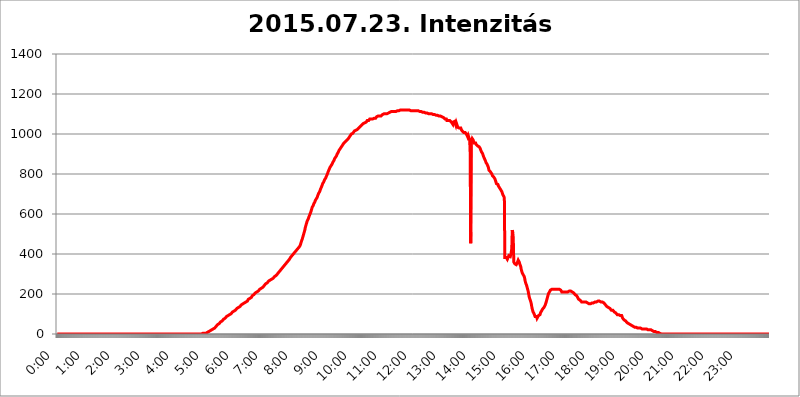
| Category | 2015.07.23. Intenzitás [W/m^2] |
|---|---|
| 0.0 | 0 |
| 0.0006944444444444445 | 0 |
| 0.001388888888888889 | 0 |
| 0.0020833333333333333 | 0 |
| 0.002777777777777778 | 0 |
| 0.003472222222222222 | 0 |
| 0.004166666666666667 | 0 |
| 0.004861111111111111 | 0 |
| 0.005555555555555556 | 0 |
| 0.0062499999999999995 | 0 |
| 0.006944444444444444 | 0 |
| 0.007638888888888889 | 0 |
| 0.008333333333333333 | 0 |
| 0.009027777777777779 | 0 |
| 0.009722222222222222 | 0 |
| 0.010416666666666666 | 0 |
| 0.011111111111111112 | 0 |
| 0.011805555555555555 | 0 |
| 0.012499999999999999 | 0 |
| 0.013194444444444444 | 0 |
| 0.013888888888888888 | 0 |
| 0.014583333333333332 | 0 |
| 0.015277777777777777 | 0 |
| 0.015972222222222224 | 0 |
| 0.016666666666666666 | 0 |
| 0.017361111111111112 | 0 |
| 0.018055555555555557 | 0 |
| 0.01875 | 0 |
| 0.019444444444444445 | 0 |
| 0.02013888888888889 | 0 |
| 0.020833333333333332 | 0 |
| 0.02152777777777778 | 0 |
| 0.022222222222222223 | 0 |
| 0.02291666666666667 | 0 |
| 0.02361111111111111 | 0 |
| 0.024305555555555556 | 0 |
| 0.024999999999999998 | 0 |
| 0.025694444444444447 | 0 |
| 0.02638888888888889 | 0 |
| 0.027083333333333334 | 0 |
| 0.027777777777777776 | 0 |
| 0.02847222222222222 | 0 |
| 0.029166666666666664 | 0 |
| 0.029861111111111113 | 0 |
| 0.030555555555555555 | 0 |
| 0.03125 | 0 |
| 0.03194444444444445 | 0 |
| 0.03263888888888889 | 0 |
| 0.03333333333333333 | 0 |
| 0.034027777777777775 | 0 |
| 0.034722222222222224 | 0 |
| 0.035416666666666666 | 0 |
| 0.036111111111111115 | 0 |
| 0.03680555555555556 | 0 |
| 0.0375 | 0 |
| 0.03819444444444444 | 0 |
| 0.03888888888888889 | 0 |
| 0.03958333333333333 | 0 |
| 0.04027777777777778 | 0 |
| 0.04097222222222222 | 0 |
| 0.041666666666666664 | 0 |
| 0.042361111111111106 | 0 |
| 0.04305555555555556 | 0 |
| 0.043750000000000004 | 0 |
| 0.044444444444444446 | 0 |
| 0.04513888888888889 | 0 |
| 0.04583333333333334 | 0 |
| 0.04652777777777778 | 0 |
| 0.04722222222222222 | 0 |
| 0.04791666666666666 | 0 |
| 0.04861111111111111 | 0 |
| 0.049305555555555554 | 0 |
| 0.049999999999999996 | 0 |
| 0.05069444444444445 | 0 |
| 0.051388888888888894 | 0 |
| 0.052083333333333336 | 0 |
| 0.05277777777777778 | 0 |
| 0.05347222222222222 | 0 |
| 0.05416666666666667 | 0 |
| 0.05486111111111111 | 0 |
| 0.05555555555555555 | 0 |
| 0.05625 | 0 |
| 0.05694444444444444 | 0 |
| 0.057638888888888885 | 0 |
| 0.05833333333333333 | 0 |
| 0.05902777777777778 | 0 |
| 0.059722222222222225 | 0 |
| 0.06041666666666667 | 0 |
| 0.061111111111111116 | 0 |
| 0.06180555555555556 | 0 |
| 0.0625 | 0 |
| 0.06319444444444444 | 0 |
| 0.06388888888888888 | 0 |
| 0.06458333333333334 | 0 |
| 0.06527777777777778 | 0 |
| 0.06597222222222222 | 0 |
| 0.06666666666666667 | 0 |
| 0.06736111111111111 | 0 |
| 0.06805555555555555 | 0 |
| 0.06874999999999999 | 0 |
| 0.06944444444444443 | 0 |
| 0.07013888888888889 | 0 |
| 0.07083333333333333 | 0 |
| 0.07152777777777779 | 0 |
| 0.07222222222222223 | 0 |
| 0.07291666666666667 | 0 |
| 0.07361111111111111 | 0 |
| 0.07430555555555556 | 0 |
| 0.075 | 0 |
| 0.07569444444444444 | 0 |
| 0.0763888888888889 | 0 |
| 0.07708333333333334 | 0 |
| 0.07777777777777778 | 0 |
| 0.07847222222222222 | 0 |
| 0.07916666666666666 | 0 |
| 0.0798611111111111 | 0 |
| 0.08055555555555556 | 0 |
| 0.08125 | 0 |
| 0.08194444444444444 | 0 |
| 0.08263888888888889 | 0 |
| 0.08333333333333333 | 0 |
| 0.08402777777777777 | 0 |
| 0.08472222222222221 | 0 |
| 0.08541666666666665 | 0 |
| 0.08611111111111112 | 0 |
| 0.08680555555555557 | 0 |
| 0.08750000000000001 | 0 |
| 0.08819444444444445 | 0 |
| 0.08888888888888889 | 0 |
| 0.08958333333333333 | 0 |
| 0.09027777777777778 | 0 |
| 0.09097222222222222 | 0 |
| 0.09166666666666667 | 0 |
| 0.09236111111111112 | 0 |
| 0.09305555555555556 | 0 |
| 0.09375 | 0 |
| 0.09444444444444444 | 0 |
| 0.09513888888888888 | 0 |
| 0.09583333333333333 | 0 |
| 0.09652777777777777 | 0 |
| 0.09722222222222222 | 0 |
| 0.09791666666666667 | 0 |
| 0.09861111111111111 | 0 |
| 0.09930555555555555 | 0 |
| 0.09999999999999999 | 0 |
| 0.10069444444444443 | 0 |
| 0.1013888888888889 | 0 |
| 0.10208333333333335 | 0 |
| 0.10277777777777779 | 0 |
| 0.10347222222222223 | 0 |
| 0.10416666666666667 | 0 |
| 0.10486111111111111 | 0 |
| 0.10555555555555556 | 0 |
| 0.10625 | 0 |
| 0.10694444444444444 | 0 |
| 0.1076388888888889 | 0 |
| 0.10833333333333334 | 0 |
| 0.10902777777777778 | 0 |
| 0.10972222222222222 | 0 |
| 0.1111111111111111 | 0 |
| 0.11180555555555556 | 0 |
| 0.11180555555555556 | 0 |
| 0.1125 | 0 |
| 0.11319444444444444 | 0 |
| 0.11388888888888889 | 0 |
| 0.11458333333333333 | 0 |
| 0.11527777777777777 | 0 |
| 0.11597222222222221 | 0 |
| 0.11666666666666665 | 0 |
| 0.1173611111111111 | 0 |
| 0.11805555555555557 | 0 |
| 0.11944444444444445 | 0 |
| 0.12013888888888889 | 0 |
| 0.12083333333333333 | 0 |
| 0.12152777777777778 | 0 |
| 0.12222222222222223 | 0 |
| 0.12291666666666667 | 0 |
| 0.12291666666666667 | 0 |
| 0.12361111111111112 | 0 |
| 0.12430555555555556 | 0 |
| 0.125 | 0 |
| 0.12569444444444444 | 0 |
| 0.12638888888888888 | 0 |
| 0.12708333333333333 | 0 |
| 0.16875 | 0 |
| 0.12847222222222224 | 0 |
| 0.12916666666666668 | 0 |
| 0.12986111111111112 | 0 |
| 0.13055555555555556 | 0 |
| 0.13125 | 0 |
| 0.13194444444444445 | 0 |
| 0.1326388888888889 | 0 |
| 0.13333333333333333 | 0 |
| 0.13402777777777777 | 0 |
| 0.13402777777777777 | 0 |
| 0.13472222222222222 | 0 |
| 0.13541666666666666 | 0 |
| 0.1361111111111111 | 0 |
| 0.13749999999999998 | 0 |
| 0.13819444444444443 | 0 |
| 0.1388888888888889 | 0 |
| 0.13958333333333334 | 0 |
| 0.14027777777777778 | 0 |
| 0.14097222222222222 | 0 |
| 0.14166666666666666 | 0 |
| 0.1423611111111111 | 0 |
| 0.14305555555555557 | 0 |
| 0.14375000000000002 | 0 |
| 0.14444444444444446 | 0 |
| 0.1451388888888889 | 0 |
| 0.1451388888888889 | 0 |
| 0.14652777777777778 | 0 |
| 0.14722222222222223 | 0 |
| 0.14791666666666667 | 0 |
| 0.1486111111111111 | 0 |
| 0.14930555555555555 | 0 |
| 0.15 | 0 |
| 0.15069444444444444 | 0 |
| 0.15138888888888888 | 0 |
| 0.15208333333333332 | 0 |
| 0.15277777777777776 | 0 |
| 0.15347222222222223 | 0 |
| 0.15416666666666667 | 0 |
| 0.15486111111111112 | 0 |
| 0.15555555555555556 | 0 |
| 0.15625 | 0 |
| 0.15694444444444444 | 0 |
| 0.15763888888888888 | 0 |
| 0.15833333333333333 | 0 |
| 0.15902777777777777 | 0 |
| 0.15972222222222224 | 0 |
| 0.16041666666666668 | 0 |
| 0.16111111111111112 | 0 |
| 0.16180555555555556 | 0 |
| 0.1625 | 0 |
| 0.16319444444444445 | 0 |
| 0.1638888888888889 | 0 |
| 0.16458333333333333 | 0 |
| 0.16527777777777777 | 0 |
| 0.16597222222222222 | 0 |
| 0.16666666666666666 | 0 |
| 0.1673611111111111 | 0 |
| 0.16805555555555554 | 0 |
| 0.16874999999999998 | 0 |
| 0.16944444444444443 | 0 |
| 0.17013888888888887 | 0 |
| 0.1708333333333333 | 0 |
| 0.17152777777777775 | 0 |
| 0.17222222222222225 | 0 |
| 0.1729166666666667 | 0 |
| 0.17361111111111113 | 0 |
| 0.17430555555555557 | 0 |
| 0.17500000000000002 | 0 |
| 0.17569444444444446 | 0 |
| 0.1763888888888889 | 0 |
| 0.17708333333333334 | 0 |
| 0.17777777777777778 | 0 |
| 0.17847222222222223 | 0 |
| 0.17916666666666667 | 0 |
| 0.1798611111111111 | 0 |
| 0.18055555555555555 | 0 |
| 0.18125 | 0 |
| 0.18194444444444444 | 0 |
| 0.1826388888888889 | 0 |
| 0.18333333333333335 | 0 |
| 0.1840277777777778 | 0 |
| 0.18472222222222223 | 0 |
| 0.18541666666666667 | 0 |
| 0.18611111111111112 | 0 |
| 0.18680555555555556 | 0 |
| 0.1875 | 0 |
| 0.18819444444444444 | 0 |
| 0.18888888888888888 | 0 |
| 0.18958333333333333 | 0 |
| 0.19027777777777777 | 0 |
| 0.1909722222222222 | 0 |
| 0.19166666666666665 | 0 |
| 0.19236111111111112 | 0 |
| 0.19305555555555554 | 0 |
| 0.19375 | 0 |
| 0.19444444444444445 | 0 |
| 0.1951388888888889 | 0 |
| 0.19583333333333333 | 0 |
| 0.19652777777777777 | 0 |
| 0.19722222222222222 | 0 |
| 0.19791666666666666 | 0 |
| 0.1986111111111111 | 0 |
| 0.19930555555555554 | 0 |
| 0.19999999999999998 | 0 |
| 0.20069444444444443 | 0 |
| 0.20138888888888887 | 0 |
| 0.2020833333333333 | 0 |
| 0.2027777777777778 | 0 |
| 0.2034722222222222 | 0 |
| 0.2041666666666667 | 3.525 |
| 0.20486111111111113 | 3.525 |
| 0.20555555555555557 | 3.525 |
| 0.20625000000000002 | 3.525 |
| 0.20694444444444446 | 3.525 |
| 0.2076388888888889 | 3.525 |
| 0.20833333333333334 | 3.525 |
| 0.20902777777777778 | 7.887 |
| 0.20972222222222223 | 7.887 |
| 0.21041666666666667 | 7.887 |
| 0.2111111111111111 | 7.887 |
| 0.21180555555555555 | 12.257 |
| 0.2125 | 12.257 |
| 0.21319444444444444 | 12.257 |
| 0.2138888888888889 | 12.257 |
| 0.21458333333333335 | 16.636 |
| 0.2152777777777778 | 16.636 |
| 0.21597222222222223 | 16.636 |
| 0.21666666666666667 | 21.024 |
| 0.21736111111111112 | 21.024 |
| 0.21805555555555556 | 21.024 |
| 0.21875 | 25.419 |
| 0.21944444444444444 | 25.419 |
| 0.22013888888888888 | 25.419 |
| 0.22083333333333333 | 29.823 |
| 0.22152777777777777 | 29.823 |
| 0.2222222222222222 | 29.823 |
| 0.22291666666666665 | 38.653 |
| 0.2236111111111111 | 38.653 |
| 0.22430555555555556 | 43.079 |
| 0.225 | 47.511 |
| 0.22569444444444445 | 47.511 |
| 0.2263888888888889 | 51.951 |
| 0.22708333333333333 | 51.951 |
| 0.22777777777777777 | 56.398 |
| 0.22847222222222222 | 56.398 |
| 0.22916666666666666 | 60.85 |
| 0.2298611111111111 | 60.85 |
| 0.23055555555555554 | 65.31 |
| 0.23124999999999998 | 65.31 |
| 0.23194444444444443 | 65.31 |
| 0.23263888888888887 | 69.775 |
| 0.2333333333333333 | 74.246 |
| 0.2340277777777778 | 74.246 |
| 0.2347222222222222 | 78.722 |
| 0.2354166666666667 | 78.722 |
| 0.23611111111111113 | 83.205 |
| 0.23680555555555557 | 83.205 |
| 0.23750000000000002 | 87.692 |
| 0.23819444444444446 | 87.692 |
| 0.2388888888888889 | 92.184 |
| 0.23958333333333334 | 92.184 |
| 0.24027777777777778 | 92.184 |
| 0.24097222222222223 | 96.682 |
| 0.24166666666666667 | 96.682 |
| 0.2423611111111111 | 101.184 |
| 0.24305555555555555 | 101.184 |
| 0.24375 | 101.184 |
| 0.24444444444444446 | 105.69 |
| 0.24513888888888888 | 105.69 |
| 0.24583333333333335 | 110.201 |
| 0.2465277777777778 | 110.201 |
| 0.24722222222222223 | 114.716 |
| 0.24791666666666667 | 114.716 |
| 0.24861111111111112 | 114.716 |
| 0.24930555555555556 | 119.235 |
| 0.25 | 119.235 |
| 0.25069444444444444 | 123.758 |
| 0.2513888888888889 | 123.758 |
| 0.2520833333333333 | 128.284 |
| 0.25277777777777777 | 128.284 |
| 0.2534722222222222 | 132.814 |
| 0.25416666666666665 | 132.814 |
| 0.2548611111111111 | 137.347 |
| 0.2555555555555556 | 137.347 |
| 0.25625000000000003 | 137.347 |
| 0.2569444444444445 | 141.884 |
| 0.2576388888888889 | 141.884 |
| 0.25833333333333336 | 146.423 |
| 0.2590277777777778 | 146.423 |
| 0.25972222222222224 | 150.964 |
| 0.2604166666666667 | 150.964 |
| 0.2611111111111111 | 150.964 |
| 0.26180555555555557 | 155.509 |
| 0.2625 | 155.509 |
| 0.26319444444444445 | 155.509 |
| 0.2638888888888889 | 160.056 |
| 0.26458333333333334 | 160.056 |
| 0.2652777777777778 | 164.605 |
| 0.2659722222222222 | 164.605 |
| 0.26666666666666666 | 164.605 |
| 0.2673611111111111 | 169.156 |
| 0.26805555555555555 | 173.709 |
| 0.26875 | 173.709 |
| 0.26944444444444443 | 173.709 |
| 0.2701388888888889 | 178.264 |
| 0.2708333333333333 | 182.82 |
| 0.27152777777777776 | 182.82 |
| 0.2722222222222222 | 182.82 |
| 0.27291666666666664 | 187.378 |
| 0.2736111111111111 | 191.937 |
| 0.2743055555555555 | 191.937 |
| 0.27499999999999997 | 191.937 |
| 0.27569444444444446 | 196.497 |
| 0.27638888888888885 | 201.058 |
| 0.27708333333333335 | 201.058 |
| 0.2777777777777778 | 205.62 |
| 0.27847222222222223 | 205.62 |
| 0.2791666666666667 | 210.182 |
| 0.2798611111111111 | 210.182 |
| 0.28055555555555556 | 210.182 |
| 0.28125 | 214.746 |
| 0.28194444444444444 | 214.746 |
| 0.2826388888888889 | 219.309 |
| 0.2833333333333333 | 219.309 |
| 0.28402777777777777 | 223.873 |
| 0.2847222222222222 | 223.873 |
| 0.28541666666666665 | 223.873 |
| 0.28611111111111115 | 228.436 |
| 0.28680555555555554 | 228.436 |
| 0.28750000000000003 | 233 |
| 0.2881944444444445 | 233 |
| 0.2888888888888889 | 237.564 |
| 0.28958333333333336 | 237.564 |
| 0.2902777777777778 | 242.127 |
| 0.29097222222222224 | 242.127 |
| 0.2916666666666667 | 246.689 |
| 0.2923611111111111 | 251.251 |
| 0.29305555555555557 | 251.251 |
| 0.29375 | 255.813 |
| 0.29444444444444445 | 255.813 |
| 0.2951388888888889 | 260.373 |
| 0.29583333333333334 | 260.373 |
| 0.2965277777777778 | 264.932 |
| 0.2972222222222222 | 264.932 |
| 0.29791666666666666 | 269.49 |
| 0.2986111111111111 | 269.49 |
| 0.29930555555555555 | 269.49 |
| 0.3 | 274.047 |
| 0.30069444444444443 | 274.047 |
| 0.3013888888888889 | 278.603 |
| 0.3020833333333333 | 278.603 |
| 0.30277777777777776 | 278.603 |
| 0.3034722222222222 | 283.156 |
| 0.30416666666666664 | 283.156 |
| 0.3048611111111111 | 287.709 |
| 0.3055555555555555 | 287.709 |
| 0.30624999999999997 | 292.259 |
| 0.3069444444444444 | 292.259 |
| 0.3076388888888889 | 296.808 |
| 0.30833333333333335 | 296.808 |
| 0.3090277777777778 | 301.354 |
| 0.30972222222222223 | 301.354 |
| 0.3104166666666667 | 305.898 |
| 0.3111111111111111 | 310.44 |
| 0.31180555555555556 | 310.44 |
| 0.3125 | 314.98 |
| 0.31319444444444444 | 319.517 |
| 0.3138888888888889 | 324.052 |
| 0.3145833333333333 | 324.052 |
| 0.31527777777777777 | 328.584 |
| 0.3159722222222222 | 333.113 |
| 0.31666666666666665 | 333.113 |
| 0.31736111111111115 | 337.639 |
| 0.31805555555555554 | 342.162 |
| 0.31875000000000003 | 342.162 |
| 0.3194444444444445 | 346.682 |
| 0.3201388888888889 | 351.198 |
| 0.32083333333333336 | 351.198 |
| 0.3215277777777778 | 355.712 |
| 0.32222222222222224 | 360.221 |
| 0.3229166666666667 | 360.221 |
| 0.3236111111111111 | 364.728 |
| 0.32430555555555557 | 369.23 |
| 0.325 | 369.23 |
| 0.32569444444444445 | 373.729 |
| 0.3263888888888889 | 378.224 |
| 0.32708333333333334 | 382.715 |
| 0.3277777777777778 | 382.715 |
| 0.3284722222222222 | 387.202 |
| 0.32916666666666666 | 391.685 |
| 0.3298611111111111 | 396.164 |
| 0.33055555555555555 | 396.164 |
| 0.33125 | 400.638 |
| 0.33194444444444443 | 405.108 |
| 0.3326388888888889 | 405.108 |
| 0.3333333333333333 | 409.574 |
| 0.3340277777777778 | 409.574 |
| 0.3347222222222222 | 414.035 |
| 0.3354166666666667 | 418.492 |
| 0.3361111111111111 | 422.943 |
| 0.3368055555555556 | 422.943 |
| 0.33749999999999997 | 427.39 |
| 0.33819444444444446 | 431.833 |
| 0.33888888888888885 | 431.833 |
| 0.33958333333333335 | 436.27 |
| 0.34027777777777773 | 440.702 |
| 0.34097222222222223 | 445.129 |
| 0.3416666666666666 | 453.968 |
| 0.3423611111111111 | 462.786 |
| 0.3430555555555555 | 467.187 |
| 0.34375 | 475.972 |
| 0.3444444444444445 | 484.735 |
| 0.3451388888888889 | 493.475 |
| 0.3458333333333334 | 502.192 |
| 0.34652777777777777 | 510.885 |
| 0.34722222222222227 | 519.555 |
| 0.34791666666666665 | 532.513 |
| 0.34861111111111115 | 541.121 |
| 0.34930555555555554 | 549.704 |
| 0.35000000000000003 | 558.261 |
| 0.3506944444444444 | 566.793 |
| 0.3513888888888889 | 571.049 |
| 0.3520833333333333 | 575.299 |
| 0.3527777777777778 | 583.779 |
| 0.3534722222222222 | 588.009 |
| 0.3541666666666667 | 596.45 |
| 0.3548611111111111 | 600.661 |
| 0.35555555555555557 | 609.062 |
| 0.35625 | 617.436 |
| 0.35694444444444445 | 625.784 |
| 0.3576388888888889 | 634.105 |
| 0.35833333333333334 | 634.105 |
| 0.3590277777777778 | 642.4 |
| 0.3597222222222222 | 650.667 |
| 0.36041666666666666 | 654.791 |
| 0.3611111111111111 | 658.909 |
| 0.36180555555555555 | 667.123 |
| 0.3625 | 671.22 |
| 0.36319444444444443 | 675.311 |
| 0.3638888888888889 | 679.395 |
| 0.3645833333333333 | 683.473 |
| 0.3652777777777778 | 691.608 |
| 0.3659722222222222 | 695.666 |
| 0.3666666666666667 | 703.762 |
| 0.3673611111111111 | 707.8 |
| 0.3680555555555556 | 711.832 |
| 0.36874999999999997 | 719.877 |
| 0.36944444444444446 | 723.889 |
| 0.37013888888888885 | 731.896 |
| 0.37083333333333335 | 735.89 |
| 0.37152777777777773 | 743.859 |
| 0.37222222222222223 | 751.803 |
| 0.3729166666666666 | 755.766 |
| 0.3736111111111111 | 759.723 |
| 0.3743055555555555 | 763.674 |
| 0.375 | 771.559 |
| 0.3756944444444445 | 775.492 |
| 0.3763888888888889 | 779.42 |
| 0.3770833333333334 | 783.342 |
| 0.37777777777777777 | 791.169 |
| 0.37847222222222227 | 795.074 |
| 0.37916666666666665 | 802.868 |
| 0.37986111111111115 | 810.641 |
| 0.38055555555555554 | 814.519 |
| 0.38125000000000003 | 822.26 |
| 0.3819444444444444 | 826.123 |
| 0.3826388888888889 | 833.834 |
| 0.3833333333333333 | 837.682 |
| 0.3840277777777778 | 841.526 |
| 0.3847222222222222 | 845.365 |
| 0.3854166666666667 | 849.199 |
| 0.3861111111111111 | 853.029 |
| 0.38680555555555557 | 860.676 |
| 0.3875 | 864.493 |
| 0.38819444444444445 | 868.305 |
| 0.3888888888888889 | 875.918 |
| 0.38958333333333334 | 879.719 |
| 0.3902777777777778 | 883.516 |
| 0.3909722222222222 | 887.309 |
| 0.39166666666666666 | 891.099 |
| 0.3923611111111111 | 898.668 |
| 0.39305555555555555 | 902.447 |
| 0.39375 | 906.223 |
| 0.39444444444444443 | 909.996 |
| 0.3951388888888889 | 917.534 |
| 0.3958333333333333 | 917.534 |
| 0.3965277777777778 | 925.06 |
| 0.3972222222222222 | 928.819 |
| 0.3979166666666667 | 932.576 |
| 0.3986111111111111 | 936.33 |
| 0.3993055555555556 | 940.082 |
| 0.39999999999999997 | 943.832 |
| 0.40069444444444446 | 947.58 |
| 0.40138888888888885 | 951.327 |
| 0.40208333333333335 | 955.071 |
| 0.40277777777777773 | 958.814 |
| 0.40347222222222223 | 958.814 |
| 0.4041666666666666 | 962.555 |
| 0.4048611111111111 | 962.555 |
| 0.4055555555555555 | 962.555 |
| 0.40625 | 970.034 |
| 0.4069444444444445 | 970.034 |
| 0.4076388888888889 | 973.772 |
| 0.4083333333333334 | 977.508 |
| 0.40902777777777777 | 981.244 |
| 0.40972222222222227 | 984.98 |
| 0.41041666666666665 | 988.714 |
| 0.41111111111111115 | 992.448 |
| 0.41180555555555554 | 992.448 |
| 0.41250000000000003 | 999.916 |
| 0.4131944444444444 | 999.916 |
| 0.4138888888888889 | 1003.65 |
| 0.4145833333333333 | 1003.65 |
| 0.4152777777777778 | 1007.383 |
| 0.4159722222222222 | 1007.383 |
| 0.4166666666666667 | 1014.852 |
| 0.4173611111111111 | 1014.852 |
| 0.41805555555555557 | 1018.587 |
| 0.41875 | 1018.587 |
| 0.41944444444444445 | 1022.323 |
| 0.4201388888888889 | 1022.323 |
| 0.42083333333333334 | 1022.323 |
| 0.4215277777777778 | 1026.06 |
| 0.4222222222222222 | 1022.323 |
| 0.42291666666666666 | 1029.798 |
| 0.4236111111111111 | 1029.798 |
| 0.42430555555555555 | 1033.537 |
| 0.425 | 1037.277 |
| 0.42569444444444443 | 1037.277 |
| 0.4263888888888889 | 1041.019 |
| 0.4270833333333333 | 1044.762 |
| 0.4277777777777778 | 1048.508 |
| 0.4284722222222222 | 1048.508 |
| 0.4291666666666667 | 1052.255 |
| 0.4298611111111111 | 1052.255 |
| 0.4305555555555556 | 1056.004 |
| 0.43124999999999997 | 1056.004 |
| 0.43194444444444446 | 1059.756 |
| 0.43263888888888885 | 1059.756 |
| 0.43333333333333335 | 1059.756 |
| 0.43402777777777773 | 1063.51 |
| 0.43472222222222223 | 1067.267 |
| 0.4354166666666666 | 1067.267 |
| 0.4361111111111111 | 1067.267 |
| 0.4368055555555555 | 1067.267 |
| 0.4375 | 1071.027 |
| 0.4381944444444445 | 1074.789 |
| 0.4388888888888889 | 1074.789 |
| 0.4395833333333334 | 1078.555 |
| 0.44027777777777777 | 1074.789 |
| 0.44097222222222227 | 1074.789 |
| 0.44166666666666665 | 1074.789 |
| 0.44236111111111115 | 1074.789 |
| 0.44305555555555554 | 1074.789 |
| 0.44375000000000003 | 1078.555 |
| 0.4444444444444444 | 1078.555 |
| 0.4451388888888889 | 1078.555 |
| 0.4458333333333333 | 1078.555 |
| 0.4465277777777778 | 1078.555 |
| 0.4472222222222222 | 1078.555 |
| 0.4479166666666667 | 1086.097 |
| 0.4486111111111111 | 1086.097 |
| 0.44930555555555557 | 1089.873 |
| 0.45 | 1089.873 |
| 0.45069444444444445 | 1086.097 |
| 0.4513888888888889 | 1086.097 |
| 0.45208333333333334 | 1089.873 |
| 0.4527777777777778 | 1089.873 |
| 0.4534722222222222 | 1086.097 |
| 0.45416666666666666 | 1089.873 |
| 0.4548611111111111 | 1093.653 |
| 0.45555555555555555 | 1093.653 |
| 0.45625 | 1097.437 |
| 0.45694444444444443 | 1097.437 |
| 0.4576388888888889 | 1101.226 |
| 0.4583333333333333 | 1101.226 |
| 0.4590277777777778 | 1101.226 |
| 0.4597222222222222 | 1101.226 |
| 0.4604166666666667 | 1101.226 |
| 0.4611111111111111 | 1101.226 |
| 0.4618055555555556 | 1101.226 |
| 0.46249999999999997 | 1101.226 |
| 0.46319444444444446 | 1105.019 |
| 0.46388888888888885 | 1105.019 |
| 0.46458333333333335 | 1105.019 |
| 0.46527777777777773 | 1105.019 |
| 0.46597222222222223 | 1108.816 |
| 0.4666666666666666 | 1108.816 |
| 0.4673611111111111 | 1112.618 |
| 0.4680555555555555 | 1112.618 |
| 0.46875 | 1112.618 |
| 0.4694444444444445 | 1112.618 |
| 0.4701388888888889 | 1112.618 |
| 0.4708333333333334 | 1112.618 |
| 0.47152777777777777 | 1116.426 |
| 0.47222222222222227 | 1112.618 |
| 0.47291666666666665 | 1112.618 |
| 0.47361111111111115 | 1112.618 |
| 0.47430555555555554 | 1112.618 |
| 0.47500000000000003 | 1112.618 |
| 0.4756944444444444 | 1112.618 |
| 0.4763888888888889 | 1112.618 |
| 0.4770833333333333 | 1116.426 |
| 0.4777777777777778 | 1120.238 |
| 0.4784722222222222 | 1120.238 |
| 0.4791666666666667 | 1116.426 |
| 0.4798611111111111 | 1120.238 |
| 0.48055555555555557 | 1120.238 |
| 0.48125 | 1120.238 |
| 0.48194444444444445 | 1120.238 |
| 0.4826388888888889 | 1120.238 |
| 0.48333333333333334 | 1120.238 |
| 0.4840277777777778 | 1120.238 |
| 0.4847222222222222 | 1124.056 |
| 0.48541666666666666 | 1120.238 |
| 0.4861111111111111 | 1124.056 |
| 0.48680555555555555 | 1124.056 |
| 0.4875 | 1120.238 |
| 0.48819444444444443 | 1120.238 |
| 0.4888888888888889 | 1120.238 |
| 0.4895833333333333 | 1120.238 |
| 0.4902777777777778 | 1120.238 |
| 0.4909722222222222 | 1120.238 |
| 0.4916666666666667 | 1120.238 |
| 0.4923611111111111 | 1120.238 |
| 0.4930555555555556 | 1120.238 |
| 0.49374999999999997 | 1120.238 |
| 0.49444444444444446 | 1120.238 |
| 0.49513888888888885 | 1120.238 |
| 0.49583333333333335 | 1116.426 |
| 0.49652777777777773 | 1116.426 |
| 0.49722222222222223 | 1116.426 |
| 0.4979166666666666 | 1116.426 |
| 0.4986111111111111 | 1116.426 |
| 0.4993055555555555 | 1116.426 |
| 0.5 | 1116.426 |
| 0.5006944444444444 | 1116.426 |
| 0.5013888888888889 | 1116.426 |
| 0.5020833333333333 | 1116.426 |
| 0.5027777777777778 | 1116.426 |
| 0.5034722222222222 | 1116.426 |
| 0.5041666666666667 | 1116.426 |
| 0.5048611111111111 | 1116.426 |
| 0.5055555555555555 | 1116.426 |
| 0.50625 | 1116.426 |
| 0.5069444444444444 | 1112.618 |
| 0.5076388888888889 | 1112.618 |
| 0.5083333333333333 | 1112.618 |
| 0.5090277777777777 | 1112.618 |
| 0.5097222222222222 | 1108.816 |
| 0.5104166666666666 | 1112.618 |
| 0.5111111111111112 | 1108.816 |
| 0.5118055555555555 | 1108.816 |
| 0.5125000000000001 | 1108.816 |
| 0.5131944444444444 | 1108.816 |
| 0.513888888888889 | 1108.816 |
| 0.5145833333333333 | 1108.816 |
| 0.5152777777777778 | 1105.019 |
| 0.5159722222222222 | 1105.019 |
| 0.5166666666666667 | 1105.019 |
| 0.517361111111111 | 1105.019 |
| 0.5180555555555556 | 1105.019 |
| 0.5187499999999999 | 1105.019 |
| 0.5194444444444445 | 1101.226 |
| 0.5201388888888888 | 1101.226 |
| 0.5208333333333334 | 1101.226 |
| 0.5215277777777778 | 1101.226 |
| 0.5222222222222223 | 1101.226 |
| 0.5229166666666667 | 1101.226 |
| 0.5236111111111111 | 1101.226 |
| 0.5243055555555556 | 1101.226 |
| 0.525 | 1101.226 |
| 0.5256944444444445 | 1097.437 |
| 0.5263888888888889 | 1097.437 |
| 0.5270833333333333 | 1097.437 |
| 0.5277777777777778 | 1097.437 |
| 0.5284722222222222 | 1097.437 |
| 0.5291666666666667 | 1097.437 |
| 0.5298611111111111 | 1093.653 |
| 0.5305555555555556 | 1093.653 |
| 0.53125 | 1093.653 |
| 0.5319444444444444 | 1093.653 |
| 0.5326388888888889 | 1093.653 |
| 0.5333333333333333 | 1093.653 |
| 0.5340277777777778 | 1089.873 |
| 0.5347222222222222 | 1089.873 |
| 0.5354166666666667 | 1089.873 |
| 0.5361111111111111 | 1089.873 |
| 0.5368055555555555 | 1089.873 |
| 0.5375 | 1089.873 |
| 0.5381944444444444 | 1089.873 |
| 0.5388888888888889 | 1086.097 |
| 0.5395833333333333 | 1086.097 |
| 0.5402777777777777 | 1086.097 |
| 0.5409722222222222 | 1086.097 |
| 0.5416666666666666 | 1082.324 |
| 0.5423611111111112 | 1078.555 |
| 0.5430555555555555 | 1078.555 |
| 0.5437500000000001 | 1074.789 |
| 0.5444444444444444 | 1074.789 |
| 0.545138888888889 | 1071.027 |
| 0.5458333333333333 | 1074.789 |
| 0.5465277777777778 | 1067.267 |
| 0.5472222222222222 | 1067.267 |
| 0.5479166666666667 | 1067.267 |
| 0.548611111111111 | 1067.267 |
| 0.5493055555555556 | 1067.267 |
| 0.5499999999999999 | 1067.267 |
| 0.5506944444444445 | 1067.267 |
| 0.5513888888888888 | 1067.267 |
| 0.5520833333333334 | 1063.51 |
| 0.5527777777777778 | 1059.756 |
| 0.5534722222222223 | 1059.756 |
| 0.5541666666666667 | 1059.756 |
| 0.5548611111111111 | 1048.508 |
| 0.5555555555555556 | 1059.756 |
| 0.55625 | 1063.51 |
| 0.5569444444444445 | 1059.756 |
| 0.5576388888888889 | 1063.51 |
| 0.5583333333333333 | 1052.255 |
| 0.5590277777777778 | 1044.762 |
| 0.5597222222222222 | 1056.004 |
| 0.5604166666666667 | 1052.255 |
| 0.5611111111111111 | 1052.255 |
| 0.5618055555555556 | 1033.537 |
| 0.5625 | 1029.798 |
| 0.5631944444444444 | 1033.537 |
| 0.5638888888888889 | 1029.798 |
| 0.5645833333333333 | 1033.537 |
| 0.5652777777777778 | 1033.537 |
| 0.5659722222222222 | 1029.798 |
| 0.5666666666666667 | 1022.323 |
| 0.5673611111111111 | 1022.323 |
| 0.5680555555555555 | 1014.852 |
| 0.56875 | 1014.852 |
| 0.5694444444444444 | 1014.852 |
| 0.5701388888888889 | 1007.383 |
| 0.5708333333333333 | 1003.65 |
| 0.5715277777777777 | 1011.118 |
| 0.5722222222222222 | 1007.383 |
| 0.5729166666666666 | 1007.383 |
| 0.5736111111111112 | 1003.65 |
| 0.5743055555555555 | 996.182 |
| 0.5750000000000001 | 992.448 |
| 0.5756944444444444 | 984.98 |
| 0.576388888888889 | 992.448 |
| 0.5770833333333333 | 992.448 |
| 0.5777777777777778 | 992.448 |
| 0.5784722222222222 | 970.034 |
| 0.5791666666666667 | 902.447 |
| 0.579861111111111 | 453.968 |
| 0.5805555555555556 | 977.508 |
| 0.5812499999999999 | 970.034 |
| 0.5819444444444445 | 977.508 |
| 0.5826388888888888 | 977.508 |
| 0.5833333333333334 | 970.034 |
| 0.5840277777777778 | 970.034 |
| 0.5847222222222223 | 955.071 |
| 0.5854166666666667 | 958.814 |
| 0.5861111111111111 | 955.071 |
| 0.5868055555555556 | 955.071 |
| 0.5875 | 947.58 |
| 0.5881944444444445 | 947.58 |
| 0.5888888888888889 | 943.832 |
| 0.5895833333333333 | 940.082 |
| 0.5902777777777778 | 940.082 |
| 0.5909722222222222 | 940.082 |
| 0.5916666666666667 | 936.33 |
| 0.5923611111111111 | 932.576 |
| 0.5930555555555556 | 928.819 |
| 0.59375 | 921.298 |
| 0.5944444444444444 | 917.534 |
| 0.5951388888888889 | 909.996 |
| 0.5958333333333333 | 906.223 |
| 0.5965277777777778 | 902.447 |
| 0.5972222222222222 | 894.885 |
| 0.5979166666666667 | 887.309 |
| 0.5986111111111111 | 883.516 |
| 0.5993055555555555 | 875.918 |
| 0.6 | 872.114 |
| 0.6006944444444444 | 864.493 |
| 0.6013888888888889 | 856.855 |
| 0.6020833333333333 | 853.029 |
| 0.6027777777777777 | 849.199 |
| 0.6034722222222222 | 845.365 |
| 0.6041666666666666 | 837.682 |
| 0.6048611111111112 | 829.981 |
| 0.6055555555555555 | 818.392 |
| 0.6062500000000001 | 818.392 |
| 0.6069444444444444 | 818.392 |
| 0.607638888888889 | 810.641 |
| 0.6083333333333333 | 806.757 |
| 0.6090277777777778 | 806.757 |
| 0.6097222222222222 | 798.974 |
| 0.6104166666666667 | 791.169 |
| 0.611111111111111 | 791.169 |
| 0.6118055555555556 | 787.258 |
| 0.6124999999999999 | 783.342 |
| 0.6131944444444445 | 779.42 |
| 0.6138888888888888 | 775.492 |
| 0.6145833333333334 | 775.492 |
| 0.6152777777777778 | 759.723 |
| 0.6159722222222223 | 751.803 |
| 0.6166666666666667 | 751.803 |
| 0.6173611111111111 | 751.803 |
| 0.6180555555555556 | 747.834 |
| 0.61875 | 739.877 |
| 0.6194444444444445 | 735.89 |
| 0.6201388888888889 | 731.896 |
| 0.6208333333333333 | 727.896 |
| 0.6215277777777778 | 723.889 |
| 0.6222222222222222 | 723.889 |
| 0.6229166666666667 | 719.877 |
| 0.6236111111111111 | 711.832 |
| 0.6243055555555556 | 703.762 |
| 0.625 | 695.666 |
| 0.6256944444444444 | 691.608 |
| 0.6263888888888889 | 687.544 |
| 0.6270833333333333 | 679.395 |
| 0.6277777777777778 | 382.715 |
| 0.6284722222222222 | 387.202 |
| 0.6291666666666667 | 382.715 |
| 0.6298611111111111 | 382.715 |
| 0.6305555555555555 | 378.224 |
| 0.63125 | 373.729 |
| 0.6319444444444444 | 373.729 |
| 0.6326388888888889 | 378.224 |
| 0.6333333333333333 | 391.685 |
| 0.6340277777777777 | 387.202 |
| 0.6347222222222222 | 387.202 |
| 0.6354166666666666 | 387.202 |
| 0.6361111111111112 | 396.164 |
| 0.6368055555555555 | 409.574 |
| 0.6375000000000001 | 427.39 |
| 0.6381944444444444 | 519.555 |
| 0.638888888888889 | 506.542 |
| 0.6395833333333333 | 480.356 |
| 0.6402777777777778 | 360.221 |
| 0.6409722222222222 | 360.221 |
| 0.6416666666666667 | 351.198 |
| 0.642361111111111 | 351.198 |
| 0.6430555555555556 | 346.682 |
| 0.6437499999999999 | 346.682 |
| 0.6444444444444445 | 351.198 |
| 0.6451388888888888 | 355.712 |
| 0.6458333333333334 | 360.221 |
| 0.6465277777777778 | 369.23 |
| 0.6472222222222223 | 369.23 |
| 0.6479166666666667 | 360.221 |
| 0.6486111111111111 | 351.198 |
| 0.6493055555555556 | 346.682 |
| 0.65 | 337.639 |
| 0.6506944444444445 | 324.052 |
| 0.6513888888888889 | 314.98 |
| 0.6520833333333333 | 305.898 |
| 0.6527777777777778 | 301.354 |
| 0.6534722222222222 | 296.808 |
| 0.6541666666666667 | 296.808 |
| 0.6548611111111111 | 287.709 |
| 0.6555555555555556 | 278.603 |
| 0.65625 | 264.932 |
| 0.6569444444444444 | 255.813 |
| 0.6576388888888889 | 251.251 |
| 0.6583333333333333 | 242.127 |
| 0.6590277777777778 | 233 |
| 0.6597222222222222 | 223.873 |
| 0.6604166666666667 | 214.746 |
| 0.6611111111111111 | 201.058 |
| 0.6618055555555555 | 187.378 |
| 0.6625 | 178.264 |
| 0.6631944444444444 | 173.709 |
| 0.6638888888888889 | 164.605 |
| 0.6645833333333333 | 155.509 |
| 0.6652777777777777 | 141.884 |
| 0.6659722222222222 | 128.284 |
| 0.6666666666666666 | 119.235 |
| 0.6673611111111111 | 110.201 |
| 0.6680555555555556 | 105.69 |
| 0.6687500000000001 | 101.184 |
| 0.6694444444444444 | 96.682 |
| 0.6701388888888888 | 87.692 |
| 0.6708333333333334 | 83.205 |
| 0.6715277777777778 | 87.692 |
| 0.6722222222222222 | 87.692 |
| 0.6729166666666666 | 78.722 |
| 0.6736111111111112 | 78.722 |
| 0.6743055555555556 | 83.205 |
| 0.6749999999999999 | 92.184 |
| 0.6756944444444444 | 92.184 |
| 0.6763888888888889 | 96.682 |
| 0.6770833333333334 | 96.682 |
| 0.6777777777777777 | 105.69 |
| 0.6784722222222223 | 110.201 |
| 0.6791666666666667 | 114.716 |
| 0.6798611111111111 | 119.235 |
| 0.6805555555555555 | 123.758 |
| 0.68125 | 123.758 |
| 0.6819444444444445 | 128.284 |
| 0.6826388888888889 | 132.814 |
| 0.6833333333333332 | 137.347 |
| 0.6840277777777778 | 141.884 |
| 0.6847222222222222 | 146.423 |
| 0.6854166666666667 | 155.509 |
| 0.686111111111111 | 164.605 |
| 0.6868055555555556 | 173.709 |
| 0.6875 | 182.82 |
| 0.6881944444444444 | 191.937 |
| 0.688888888888889 | 201.058 |
| 0.6895833333333333 | 205.62 |
| 0.6902777777777778 | 210.182 |
| 0.6909722222222222 | 214.746 |
| 0.6916666666666668 | 219.309 |
| 0.6923611111111111 | 219.309 |
| 0.6930555555555555 | 223.873 |
| 0.69375 | 223.873 |
| 0.6944444444444445 | 223.873 |
| 0.6951388888888889 | 223.873 |
| 0.6958333333333333 | 223.873 |
| 0.6965277777777777 | 223.873 |
| 0.6972222222222223 | 223.873 |
| 0.6979166666666666 | 223.873 |
| 0.6986111111111111 | 223.873 |
| 0.6993055555555556 | 223.873 |
| 0.7000000000000001 | 223.873 |
| 0.7006944444444444 | 223.873 |
| 0.7013888888888888 | 223.873 |
| 0.7020833333333334 | 223.873 |
| 0.7027777777777778 | 223.873 |
| 0.7034722222222222 | 223.873 |
| 0.7041666666666666 | 223.873 |
| 0.7048611111111112 | 219.309 |
| 0.7055555555555556 | 219.309 |
| 0.7062499999999999 | 219.309 |
| 0.7069444444444444 | 214.746 |
| 0.7076388888888889 | 210.182 |
| 0.7083333333333334 | 210.182 |
| 0.7090277777777777 | 205.62 |
| 0.7097222222222223 | 210.182 |
| 0.7104166666666667 | 210.182 |
| 0.7111111111111111 | 210.182 |
| 0.7118055555555555 | 210.182 |
| 0.7125 | 210.182 |
| 0.7131944444444445 | 210.182 |
| 0.7138888888888889 | 210.182 |
| 0.7145833333333332 | 210.182 |
| 0.7152777777777778 | 210.182 |
| 0.7159722222222222 | 210.182 |
| 0.7166666666666667 | 210.182 |
| 0.717361111111111 | 214.746 |
| 0.7180555555555556 | 214.746 |
| 0.71875 | 214.746 |
| 0.7194444444444444 | 214.746 |
| 0.720138888888889 | 214.746 |
| 0.7208333333333333 | 210.182 |
| 0.7215277777777778 | 210.182 |
| 0.7222222222222222 | 210.182 |
| 0.7229166666666668 | 210.182 |
| 0.7236111111111111 | 210.182 |
| 0.7243055555555555 | 205.62 |
| 0.725 | 205.62 |
| 0.7256944444444445 | 201.058 |
| 0.7263888888888889 | 196.497 |
| 0.7270833333333333 | 196.497 |
| 0.7277777777777777 | 191.937 |
| 0.7284722222222223 | 191.937 |
| 0.7291666666666666 | 187.378 |
| 0.7298611111111111 | 182.82 |
| 0.7305555555555556 | 178.264 |
| 0.7312500000000001 | 173.709 |
| 0.7319444444444444 | 173.709 |
| 0.7326388888888888 | 169.156 |
| 0.7333333333333334 | 169.156 |
| 0.7340277777777778 | 164.605 |
| 0.7347222222222222 | 164.605 |
| 0.7354166666666666 | 160.056 |
| 0.7361111111111112 | 160.056 |
| 0.7368055555555556 | 160.056 |
| 0.7374999999999999 | 160.056 |
| 0.7381944444444444 | 160.056 |
| 0.7388888888888889 | 160.056 |
| 0.7395833333333334 | 160.056 |
| 0.7402777777777777 | 160.056 |
| 0.7409722222222223 | 160.056 |
| 0.7416666666666667 | 160.056 |
| 0.7423611111111111 | 160.056 |
| 0.7430555555555555 | 155.509 |
| 0.74375 | 155.509 |
| 0.7444444444444445 | 155.509 |
| 0.7451388888888889 | 150.964 |
| 0.7458333333333332 | 150.964 |
| 0.7465277777777778 | 150.964 |
| 0.7472222222222222 | 150.964 |
| 0.7479166666666667 | 150.964 |
| 0.748611111111111 | 150.964 |
| 0.7493055555555556 | 150.964 |
| 0.75 | 155.509 |
| 0.7506944444444444 | 155.509 |
| 0.751388888888889 | 155.509 |
| 0.7520833333333333 | 155.509 |
| 0.7527777777777778 | 155.509 |
| 0.7534722222222222 | 160.056 |
| 0.7541666666666668 | 160.056 |
| 0.7548611111111111 | 160.056 |
| 0.7555555555555555 | 160.056 |
| 0.75625 | 160.056 |
| 0.7569444444444445 | 164.605 |
| 0.7576388888888889 | 164.605 |
| 0.7583333333333333 | 164.605 |
| 0.7590277777777777 | 164.605 |
| 0.7597222222222223 | 164.605 |
| 0.7604166666666666 | 164.605 |
| 0.7611111111111111 | 164.605 |
| 0.7618055555555556 | 164.605 |
| 0.7625000000000001 | 160.056 |
| 0.7631944444444444 | 160.056 |
| 0.7638888888888888 | 160.056 |
| 0.7645833333333334 | 160.056 |
| 0.7652777777777778 | 155.509 |
| 0.7659722222222222 | 155.509 |
| 0.7666666666666666 | 155.509 |
| 0.7673611111111112 | 150.964 |
| 0.7680555555555556 | 150.964 |
| 0.7687499999999999 | 146.423 |
| 0.7694444444444444 | 146.423 |
| 0.7701388888888889 | 141.884 |
| 0.7708333333333334 | 137.347 |
| 0.7715277777777777 | 137.347 |
| 0.7722222222222223 | 132.814 |
| 0.7729166666666667 | 132.814 |
| 0.7736111111111111 | 132.814 |
| 0.7743055555555555 | 132.814 |
| 0.775 | 128.284 |
| 0.7756944444444445 | 128.284 |
| 0.7763888888888889 | 123.758 |
| 0.7770833333333332 | 119.235 |
| 0.7777777777777778 | 119.235 |
| 0.7784722222222222 | 119.235 |
| 0.7791666666666667 | 119.235 |
| 0.779861111111111 | 114.716 |
| 0.7805555555555556 | 114.716 |
| 0.78125 | 110.201 |
| 0.7819444444444444 | 110.201 |
| 0.782638888888889 | 105.69 |
| 0.7833333333333333 | 105.69 |
| 0.7840277777777778 | 105.69 |
| 0.7847222222222222 | 105.69 |
| 0.7854166666666668 | 96.682 |
| 0.7861111111111111 | 96.682 |
| 0.7868055555555555 | 96.682 |
| 0.7875 | 96.682 |
| 0.7881944444444445 | 96.682 |
| 0.7888888888888889 | 96.682 |
| 0.7895833333333333 | 92.184 |
| 0.7902777777777777 | 92.184 |
| 0.7909722222222223 | 92.184 |
| 0.7916666666666666 | 92.184 |
| 0.7923611111111111 | 92.184 |
| 0.7930555555555556 | 78.722 |
| 0.7937500000000001 | 74.246 |
| 0.7944444444444444 | 74.246 |
| 0.7951388888888888 | 69.775 |
| 0.7958333333333334 | 69.775 |
| 0.7965277777777778 | 65.31 |
| 0.7972222222222222 | 65.31 |
| 0.7979166666666666 | 65.31 |
| 0.7986111111111112 | 60.85 |
| 0.7993055555555556 | 56.398 |
| 0.7999999999999999 | 56.398 |
| 0.8006944444444444 | 56.398 |
| 0.8013888888888889 | 51.951 |
| 0.8020833333333334 | 51.951 |
| 0.8027777777777777 | 47.511 |
| 0.8034722222222223 | 47.511 |
| 0.8041666666666667 | 43.079 |
| 0.8048611111111111 | 43.079 |
| 0.8055555555555555 | 43.079 |
| 0.80625 | 38.653 |
| 0.8069444444444445 | 38.653 |
| 0.8076388888888889 | 38.653 |
| 0.8083333333333332 | 34.234 |
| 0.8090277777777778 | 34.234 |
| 0.8097222222222222 | 34.234 |
| 0.8104166666666667 | 34.234 |
| 0.811111111111111 | 34.234 |
| 0.8118055555555556 | 34.234 |
| 0.8125 | 29.823 |
| 0.8131944444444444 | 29.823 |
| 0.813888888888889 | 29.823 |
| 0.8145833333333333 | 29.823 |
| 0.8152777777777778 | 29.823 |
| 0.8159722222222222 | 29.823 |
| 0.8166666666666668 | 29.823 |
| 0.8173611111111111 | 29.823 |
| 0.8180555555555555 | 29.823 |
| 0.81875 | 25.419 |
| 0.8194444444444445 | 25.419 |
| 0.8201388888888889 | 25.419 |
| 0.8208333333333333 | 25.419 |
| 0.8215277777777777 | 25.419 |
| 0.8222222222222223 | 25.419 |
| 0.8229166666666666 | 25.419 |
| 0.8236111111111111 | 25.419 |
| 0.8243055555555556 | 25.419 |
| 0.8250000000000001 | 25.419 |
| 0.8256944444444444 | 25.419 |
| 0.8263888888888888 | 25.419 |
| 0.8270833333333334 | 25.419 |
| 0.8277777777777778 | 25.419 |
| 0.8284722222222222 | 21.024 |
| 0.8291666666666666 | 21.024 |
| 0.8298611111111112 | 21.024 |
| 0.8305555555555556 | 21.024 |
| 0.8312499999999999 | 21.024 |
| 0.8319444444444444 | 21.024 |
| 0.8326388888888889 | 21.024 |
| 0.8333333333333334 | 16.636 |
| 0.8340277777777777 | 16.636 |
| 0.8347222222222223 | 16.636 |
| 0.8354166666666667 | 16.636 |
| 0.8361111111111111 | 12.257 |
| 0.8368055555555555 | 12.257 |
| 0.8375 | 12.257 |
| 0.8381944444444445 | 12.257 |
| 0.8388888888888889 | 12.257 |
| 0.8395833333333332 | 12.257 |
| 0.8402777777777778 | 12.257 |
| 0.8409722222222222 | 7.887 |
| 0.8416666666666667 | 7.887 |
| 0.842361111111111 | 7.887 |
| 0.8430555555555556 | 7.887 |
| 0.84375 | 3.525 |
| 0.8444444444444444 | 3.525 |
| 0.845138888888889 | 3.525 |
| 0.8458333333333333 | 3.525 |
| 0.8465277777777778 | 0 |
| 0.8472222222222222 | 0 |
| 0.8479166666666668 | 0 |
| 0.8486111111111111 | 0 |
| 0.8493055555555555 | 0 |
| 0.85 | 0 |
| 0.8506944444444445 | 0 |
| 0.8513888888888889 | 0 |
| 0.8520833333333333 | 0 |
| 0.8527777777777777 | 0 |
| 0.8534722222222223 | 0 |
| 0.8541666666666666 | 0 |
| 0.8548611111111111 | 0 |
| 0.8555555555555556 | 0 |
| 0.8562500000000001 | 0 |
| 0.8569444444444444 | 0 |
| 0.8576388888888888 | 0 |
| 0.8583333333333334 | 0 |
| 0.8590277777777778 | 0 |
| 0.8597222222222222 | 0 |
| 0.8604166666666666 | 0 |
| 0.8611111111111112 | 0 |
| 0.8618055555555556 | 0 |
| 0.8624999999999999 | 0 |
| 0.8631944444444444 | 0 |
| 0.8638888888888889 | 0 |
| 0.8645833333333334 | 0 |
| 0.8652777777777777 | 0 |
| 0.8659722222222223 | 0 |
| 0.8666666666666667 | 0 |
| 0.8673611111111111 | 0 |
| 0.8680555555555555 | 0 |
| 0.86875 | 0 |
| 0.8694444444444445 | 0 |
| 0.8701388888888889 | 0 |
| 0.8708333333333332 | 0 |
| 0.8715277777777778 | 0 |
| 0.8722222222222222 | 0 |
| 0.8729166666666667 | 0 |
| 0.873611111111111 | 0 |
| 0.8743055555555556 | 0 |
| 0.875 | 0 |
| 0.8756944444444444 | 0 |
| 0.876388888888889 | 0 |
| 0.8770833333333333 | 0 |
| 0.8777777777777778 | 0 |
| 0.8784722222222222 | 0 |
| 0.8791666666666668 | 0 |
| 0.8798611111111111 | 0 |
| 0.8805555555555555 | 0 |
| 0.88125 | 0 |
| 0.8819444444444445 | 0 |
| 0.8826388888888889 | 0 |
| 0.8833333333333333 | 0 |
| 0.8840277777777777 | 0 |
| 0.8847222222222223 | 0 |
| 0.8854166666666666 | 0 |
| 0.8861111111111111 | 0 |
| 0.8868055555555556 | 0 |
| 0.8875000000000001 | 0 |
| 0.8881944444444444 | 0 |
| 0.8888888888888888 | 0 |
| 0.8895833333333334 | 0 |
| 0.8902777777777778 | 0 |
| 0.8909722222222222 | 0 |
| 0.8916666666666666 | 0 |
| 0.8923611111111112 | 0 |
| 0.8930555555555556 | 0 |
| 0.8937499999999999 | 0 |
| 0.8944444444444444 | 0 |
| 0.8951388888888889 | 0 |
| 0.8958333333333334 | 0 |
| 0.8965277777777777 | 0 |
| 0.8972222222222223 | 0 |
| 0.8979166666666667 | 0 |
| 0.8986111111111111 | 0 |
| 0.8993055555555555 | 0 |
| 0.9 | 0 |
| 0.9006944444444445 | 0 |
| 0.9013888888888889 | 0 |
| 0.9020833333333332 | 0 |
| 0.9027777777777778 | 0 |
| 0.9034722222222222 | 0 |
| 0.9041666666666667 | 0 |
| 0.904861111111111 | 0 |
| 0.9055555555555556 | 0 |
| 0.90625 | 0 |
| 0.9069444444444444 | 0 |
| 0.907638888888889 | 0 |
| 0.9083333333333333 | 0 |
| 0.9090277777777778 | 0 |
| 0.9097222222222222 | 0 |
| 0.9104166666666668 | 0 |
| 0.9111111111111111 | 0 |
| 0.9118055555555555 | 0 |
| 0.9125 | 0 |
| 0.9131944444444445 | 0 |
| 0.9138888888888889 | 0 |
| 0.9145833333333333 | 0 |
| 0.9152777777777777 | 0 |
| 0.9159722222222223 | 0 |
| 0.9166666666666666 | 0 |
| 0.9173611111111111 | 0 |
| 0.9180555555555556 | 0 |
| 0.9187500000000001 | 0 |
| 0.9194444444444444 | 0 |
| 0.9201388888888888 | 0 |
| 0.9208333333333334 | 0 |
| 0.9215277777777778 | 0 |
| 0.9222222222222222 | 0 |
| 0.9229166666666666 | 0 |
| 0.9236111111111112 | 0 |
| 0.9243055555555556 | 0 |
| 0.9249999999999999 | 0 |
| 0.9256944444444444 | 0 |
| 0.9263888888888889 | 0 |
| 0.9270833333333334 | 0 |
| 0.9277777777777777 | 0 |
| 0.9284722222222223 | 0 |
| 0.9291666666666667 | 0 |
| 0.9298611111111111 | 0 |
| 0.9305555555555555 | 0 |
| 0.93125 | 0 |
| 0.9319444444444445 | 0 |
| 0.9326388888888889 | 0 |
| 0.9333333333333332 | 0 |
| 0.9340277777777778 | 0 |
| 0.9347222222222222 | 0 |
| 0.9354166666666667 | 0 |
| 0.936111111111111 | 0 |
| 0.9368055555555556 | 0 |
| 0.9375 | 0 |
| 0.9381944444444444 | 0 |
| 0.938888888888889 | 0 |
| 0.9395833333333333 | 0 |
| 0.9402777777777778 | 0 |
| 0.9409722222222222 | 0 |
| 0.9416666666666668 | 0 |
| 0.9423611111111111 | 0 |
| 0.9430555555555555 | 0 |
| 0.94375 | 0 |
| 0.9444444444444445 | 0 |
| 0.9451388888888889 | 0 |
| 0.9458333333333333 | 0 |
| 0.9465277777777777 | 0 |
| 0.9472222222222223 | 0 |
| 0.9479166666666666 | 0 |
| 0.9486111111111111 | 0 |
| 0.9493055555555556 | 0 |
| 0.9500000000000001 | 0 |
| 0.9506944444444444 | 0 |
| 0.9513888888888888 | 0 |
| 0.9520833333333334 | 0 |
| 0.9527777777777778 | 0 |
| 0.9534722222222222 | 0 |
| 0.9541666666666666 | 0 |
| 0.9548611111111112 | 0 |
| 0.9555555555555556 | 0 |
| 0.9562499999999999 | 0 |
| 0.9569444444444444 | 0 |
| 0.9576388888888889 | 0 |
| 0.9583333333333334 | 0 |
| 0.9590277777777777 | 0 |
| 0.9597222222222223 | 0 |
| 0.9604166666666667 | 0 |
| 0.9611111111111111 | 0 |
| 0.9618055555555555 | 0 |
| 0.9625 | 0 |
| 0.9631944444444445 | 0 |
| 0.9638888888888889 | 0 |
| 0.9645833333333332 | 0 |
| 0.9652777777777778 | 0 |
| 0.9659722222222222 | 0 |
| 0.9666666666666667 | 0 |
| 0.967361111111111 | 0 |
| 0.9680555555555556 | 0 |
| 0.96875 | 0 |
| 0.9694444444444444 | 0 |
| 0.970138888888889 | 0 |
| 0.9708333333333333 | 0 |
| 0.9715277777777778 | 0 |
| 0.9722222222222222 | 0 |
| 0.9729166666666668 | 0 |
| 0.9736111111111111 | 0 |
| 0.9743055555555555 | 0 |
| 0.975 | 0 |
| 0.9756944444444445 | 0 |
| 0.9763888888888889 | 0 |
| 0.9770833333333333 | 0 |
| 0.9777777777777777 | 0 |
| 0.9784722222222223 | 0 |
| 0.9791666666666666 | 0 |
| 0.9798611111111111 | 0 |
| 0.9805555555555556 | 0 |
| 0.9812500000000001 | 0 |
| 0.9819444444444444 | 0 |
| 0.9826388888888888 | 0 |
| 0.9833333333333334 | 0 |
| 0.9840277777777778 | 0 |
| 0.9847222222222222 | 0 |
| 0.9854166666666666 | 0 |
| 0.9861111111111112 | 0 |
| 0.9868055555555556 | 0 |
| 0.9874999999999999 | 0 |
| 0.9881944444444444 | 0 |
| 0.9888888888888889 | 0 |
| 0.9895833333333334 | 0 |
| 0.9902777777777777 | 0 |
| 0.9909722222222223 | 0 |
| 0.9916666666666667 | 0 |
| 0.9923611111111111 | 0 |
| 0.9930555555555555 | 0 |
| 0.99375 | 0 |
| 0.9944444444444445 | 0 |
| 0.9951388888888889 | 0 |
| 0.9958333333333332 | 0 |
| 0.9965277777777778 | 0 |
| 0.9972222222222222 | 0 |
| 0.9979166666666667 | 0 |
| 0.998611111111111 | 0 |
| 0.9993055555555556 | 0 |